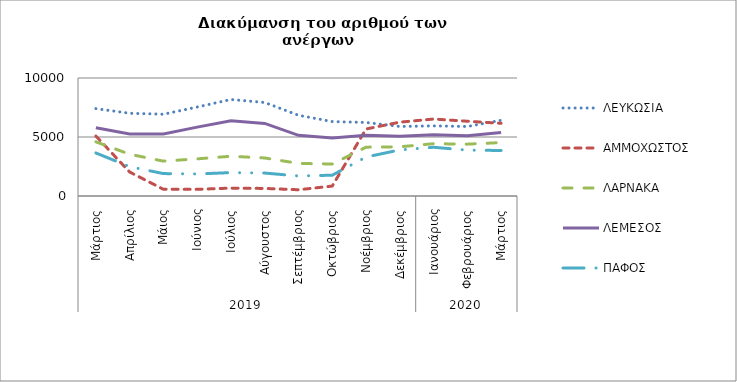
| Category | ΛΕΥΚΩΣΙΑ | ΑΜΜΟΧΩΣΤΟΣ | ΛΑΡΝΑΚΑ | ΛΕΜΕΣΟΣ | ΠΑΦΟΣ |
|---|---|---|---|---|---|
| 0 | 7405 | 5083 | 4589 | 5785 | 3646 |
| 1 | 7010 | 2030 | 3539 | 5250 | 2486 |
| 2 | 6929 | 570 | 2955 | 5254 | 1899 |
| 3 | 7540 | 567 | 3149 | 5837 | 1867 |
| 4 | 8179 | 668 | 3369 | 6382 | 1984 |
| 5 | 7922 | 641 | 3223 | 6153 | 1944 |
| 6 | 6840 | 529 | 2762 | 5139 | 1697 |
| 7 | 6306 | 843 | 2710 | 4922 | 1763 |
| 8 | 6231 | 5679 | 4139 | 5142 | 3304 |
| 9 | 5893 | 6256 | 4171 | 5061 | 3904 |
| 10 | 5943 | 6524 | 4433 | 5185 | 4129 |
| 11 | 5890 | 6335 | 4394 | 5114 | 3887 |
| 12 | 6416 | 6162 | 4527 | 5390 | 3858 |